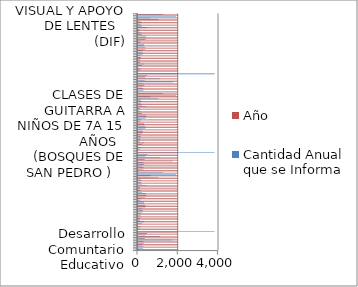
| Category | Cantidad Anual que se Informa | Año | Denominación del servicio |
|---|---|---|---|
| Desarrollo Comuntario Educativo | 100 | 2016 |  |
| Apoyo Escolar a niños de 5-12 años (San Antonio) | 300 | 2016 |  |
| Apoyo escolar a niños de 6 a 12 años en DIF | 300 | 2016 |  |
| Apoyo escolar niños de 6-12 años (Bosques de San Pedro) | 240 | 2016 |  |
| APOYO ESCOLAR  NIÑOS DE 5-12 AÑOS            (LOS REYES ) | 360 | 2016 |  |
| APOYO ESCOLAR    NIÑOS DE 5-12 AÑOS           (LOS  ENCINOS)  | 300 | 2016 |  |
| APOYO  EDUCATIVO CON ENFASIS EN LENGUAJE (DIF) | 1776 | 2016 |  |
| APOYO  PSICOLOGICO INFANTIL (DIF) | 366 | 2016 |  |
| APOYO  PSICOLOGICO  A ADOLESENTES (DIF) | 1128 | 2016 |  |
| APOYO  PSICOLOGICO  A ADULTOS (DIF) | 402 | 2016 |  |
| TERAPIAS DE GRUPO  (DIF)   | 492 | 2016 |  |
| REHABILITACION FISICA (DIF)  | 3840 | 2016 |  |
| APOYO DE EDUCACION EN  BRAYLE   (DIF) | 60 | 2016 |  |
| CLASES DE GUITARRA       (NIÑOS DE GUARDERIAS)    | 120 | 2016 |  |
| CLASES DE GUITARRA A NIÑOS DE 7  A 15 AÑOS  (DIF) | 180 | 2016 |  |
| CLASES DE GUITARRA A JOVENES MAYORES DE 15 AÑOS    (DIF) | 60 | 2016 |  |
| CLASES DE COMPUTACION  A  NIÑOS DE 7 A 12   AÑOS   (DIF) | 240 | 2016 |  |
| CLASES DE COMPUTACION  A  JOVENES MAYORES  DE 12   AÑOS (DIF)   | 360 | 2016 |  |
| CLASES DE GUITARRA A NIÑOS DE 7A 15 AÑOS (SAN ANTONIO)   | 144 | 2016 |  |
| CLASES DE GUITARRA A JOVENES MAYORES DE 15 AÑOS   (SAN ANTONIO)   | 144 | 2016 |  |
| CLASES DE COMPUTACION  A  NIÑOS DE 7 A 12   AÑOS               (SAN ANTONIO)   | 180 | 2016 |  |
| CLASES DE COMPUTACION  A  JOVENES MAYORES  DE 12   AÑOS                              (SAN ANTONIO)    | 180 | 2016 |  |
| CLASES DE GUITARRA A NIÑOS DE 7A 15 AÑOS   (BOSQUES DE SAN PEDRO )    | 180 | 2016 |  |
| CLASES DE GUITARRA A JOVENES MAYORES DE 15 AÑOS  (BOSQUES DE SAN PEDRO  )  | 270 | 2016 |  |
| CLASES DE COMPUTACION  A NIÑOS DE 7A 15 AÑOS   (BOSQUE SAN PEDRO  )    | 270 | 2016 |  |
| CLASES DE COMPUTACION  A JOVENES MAYORES DE 15 AÑOS  (BOSQUES PEDRO )  | 270 | 2016 |  |
| CLASES DE GUITARRA A NIÑOS DE 7A 15 AÑOS   (LOS REYES  )    | 420 | 2016 |  |
| CLASES DE GUITARRA A JOVENES MAYORES DE 15 AÑOS  (LOS REYES )  | 420 | 2016 |  |
| CLASES DE COMPUTACION  A NIÑOS DE 7A 15 AÑOS   (LOS REYES )    | 360 | 2016 |  |
| CLASES DE COMPUTACION  A JOVENES MAYORES DE 15 AÑOS  (LOS REYES )  | 360 | 2016 |  |
| CLASES DE GUITARRA A NIÑOS DE 7A 15 AÑOS   (LOS ENCINOS  )    | 144 | 2016 |  |
| CLASES DE GUITARRA A JOVENES MAYORES DE 15 AÑOS  (LOS ENCINOS  )  | 180 | 2016 |  |
| CLASES DE COMPUTACION A NIÑOS DE 7A 15 AÑOS   (LOS ENCINOS  )    | 420 | 2016 |  |
| CLASES DE COMPUTACION A JOVENES MAYORES DE 15 AÑOS  (LOS  ENCINOS  )  | 470 | 2016 |  |
| CLASES  MANUALIDADES Y BISUTERIA  AÑOS  (DIF) | 432 | 2016 |  |
| CLASES  MANUALIDADES Y BISUTERIA                     (SAN ANTONIO ) | 240 | 2016 |  |
| CLASES  MANUALIDADES Y BISUTERIA  AÑOS  (BOSQUES DE SABN PEDRO ) | 180 | 2016 |  |
| CLASES  MANUALIDADES Y BISUTERIA (LOS REYES ) | 120 | 2016 |  |
| CLASES DE  MANUALIDADES LOS (ENCINOS ) | 150 | 2016 |  |
| CLASES  MANUALIDADES Y BISUTERIA   (DIF) | 480 | 2016 |  |
| CLASES  MANUALIDADES Y BISUTERIA (SAN ANTONIO ) | 240 | 2016 |  |
| CLASES  MANUALIDADES Y BISUTERIA   (BOSQUES DE SAN PEDRO ) | 180 | 2016 |  |
| CLASES  MANUALIDADES Y BISUTERIA (LOS REYES ) | 240 | 2016 |  |
| CLASES DE  MANUALIDADES LOS (ENCINOS ) | 180 | 2016 |  |
| REVICION VISUAL Y APOYO DE LENTES   (DIF) | 1056 | 2016 |  |
| APOYO JURIDICO A NIÑAS NIÑOS Y ADOLECENTES    (DIF) | 660 | 2016 |  |
| APOYO JURIDICO Y ASESORIAS LEGALES   (DIF) | 1920 | 2016 |  |
| Consultas médicas | 1272 | 2016 |  |
| Desarrollo Comuntario Educativo | 100 | 2017 |  |
| Apoyo Escolar a niños de 5-12 años (San Antonio) | 300 | 2017 |  |
| Apoyo escolar a niños de 6 a 12 años en DIF | 300 | 2017 |  |
| Apoyo escolar niños de 6-12 años (Bosques de San Pedro) | 240 | 2017 |  |
| APOYO ESCOLAR  NIÑOS DE 5-12 AÑOS            (LOS REYES ) | 360 | 2017 |  |
| APOYO ESCOLAR    NIÑOS DE 5-12 AÑOS           (LOS  ENCINOS)  | 300 | 2017 |  |
| APOYO  EDUCATIVO CON ENFASIS EN LENGUAJE (DIF) | 1776 | 2017 |  |
| APOYO  PSICOLOGICO INFANTIL (DIF) | 366 | 2017 |  |
| APOYO  PSICOLOGICO  A ADOLESENTES (DIF) | 1128 | 2017 |  |
| APOYO  PSICOLOGICO  A ADULTOS (DIF) | 402 | 2017 |  |
| TERAPIAS DE GRUPO  (DIF)   | 492 | 2017 |  |
| REHABILITACION FISICA (DIF)  | 3840 | 2017 |  |
| APOYO DE EDUCACION EN  BRAYLE   (DIF) | 60 | 2017 |  |
| CLASES DE GUITARRA       (NIÑOS DE GUARDERIAS)    | 120 | 2017 |  |
| CLASES DE GUITARRA A NIÑOS DE 7  A 15 AÑOS  (DIF) | 180 | 2017 |  |
| CLASES DE GUITARRA A JOVENES MAYORES DE 15 AÑOS    (DIF) | 60 | 2017 |  |
| CLASES DE COMPUTACION  A  NIÑOS DE 7 A 12   AÑOS   (DIF) | 240 | 2017 |  |
| CLASES DE COMPUTACION  A  JOVENES MAYORES  DE 12   AÑOS (DIF)   | 360 | 2017 |  |
| CLASES DE GUITARRA A NIÑOS DE 7A 15 AÑOS (SAN ANTONIO)   | 144 | 2017 |  |
| CLASES DE GUITARRA A JOVENES MAYORES DE 15 AÑOS   (SAN ANTONIO)   | 144 | 2017 |  |
| CLASES DE COMPUTACION  A  NIÑOS DE 7 A 12   AÑOS               (SAN ANTONIO)   | 180 | 2017 |  |
| CLASES DE COMPUTACION  A  JOVENES MAYORES  DE 12   AÑOS                              (SAN ANTONIO)    | 180 | 2017 |  |
| CLASES DE GUITARRA A NIÑOS DE 7A 15 AÑOS   (BOSQUES DE SAN PEDRO )    | 180 | 2017 |  |
| CLASES DE GUITARRA A JOVENES MAYORES DE 15 AÑOS  (BOSQUES DE SAN PEDRO  )  | 270 | 2017 |  |
| CLASES DE COMPUTACION  A NIÑOS DE 7A 15 AÑOS   (BOSQUE SAN PEDRO  )    | 270 | 2017 |  |
| CLASES DE COMPUTACION  A JOVENES MAYORES DE 15 AÑOS  (BOSQUES PEDRO )  | 270 | 2017 |  |
| CLASES DE GUITARRA A NIÑOS DE 7A 15 AÑOS   (LOS REYES  )    | 420 | 2017 |  |
| CLASES DE GUITARRA A JOVENES MAYORES DE 15 AÑOS  (LOS REYES )  | 420 | 2017 |  |
| CLASES DE COMPUTACION  A NIÑOS DE 7A 15 AÑOS   (LOS REYES )    | 360 | 2017 |  |
| CLASES DE COMPUTACION  A JOVENES MAYORES DE 15 AÑOS  (LOS REYES )  | 360 | 2017 |  |
| CLASES DE GUITARRA A NIÑOS DE 7A 15 AÑOS   (LOS ENCINOS  )    | 144 | 2017 |  |
| CLASES DE GUITARRA A JOVENES MAYORES DE 15 AÑOS  (LOS ENCINOS  )  | 180 | 2017 |  |
| CLASES DE COMPUTACION A NIÑOS DE 7A 15 AÑOS   (LOS ENCINOS  )    | 420 | 2017 |  |
| CLASES DE COMPUTACION A JOVENES MAYORES DE 15 AÑOS  (LOS  ENCINOS  )  | 470 | 2017 |  |
| CLASES  MANUALIDADES Y BISUTERIA  AÑOS  (DIF) | 432 | 2017 |  |
| CLASES  MANUALIDADES Y BISUTERIA                     (SAN ANTONIO ) | 240 | 2017 |  |
| CLASES  MANUALIDADES Y BISUTERIA  AÑOS  (BOSQUES DE SABN PEDRO ) | 180 | 2017 |  |
| CLASES  MANUALIDADES Y BISUTERIA (LOS REYES ) | 120 | 2017 |  |
| CLASES DE  MANUALIDADES LOS (ENCINOS ) | 150 | 2017 |  |
| CLASES  MANUALIDADES Y BISUTERIA   (DIF) | 480 | 2017 |  |
| CLASES  MANUALIDADES Y BISUTERIA (SAN ANTONIO ) | 240 | 2017 |  |
| CLASES  MANUALIDADES Y BISUTERIA   (BOSQUES DE SAN PEDRO ) | 180 | 2017 |  |
| CLASES  MANUALIDADES Y BISUTERIA (LOS REYES ) | 240 | 2017 |  |
| CLASES DE  MANUALIDADES LOS (ENCINOS ) | 180 | 2017 |  |
| REVICION VISUAL Y APOYO DE LENTES   (DIF) | 1056 | 2017 |  |
| APOYO JURIDICO A NIÑAS NIÑOS Y ADOLECENTES    (DIF) | 660 | 2017 |  |
| APOYO JURIDICO Y ASESORIAS LEGALES   (DIF) | 1920 | 2017 |  |
| Consultas médicas | 1272 | 2017 |  |
| Desarrollo Comuntario Educativo | 100 | 2018 |  |
| Apoyo Escolar a niños de 5-12 años (San Antonio) | 300 | 2018 |  |
| Apoyo escolar a niños de 6 a 12 años en DIF | 300 | 2018 |  |
| Apoyo escolar niños de 6-12 años (Bosques de San Pedro) | 240 | 2018 |  |
| APOYO ESCOLAR  NIÑOS DE 5-12 AÑOS            (LOS REYES ) | 360 | 2018 |  |
| APOYO ESCOLAR    NIÑOS DE 5-12 AÑOS           (LOS  ENCINOS)  | 300 | 2018 |  |
| APOYO  EDUCATIVO CON ENFASIS EN LENGUAJE (DIF) | 1776 | 2018 |  |
| APOYO  PSICOLOGICO INFANTIL (DIF) | 366 | 2018 |  |
| APOYO  PSICOLOGICO  A ADOLESENTES (DIF) | 1128 | 2018 |  |
| APOYO  PSICOLOGICO  A ADULTOS (DIF) | 402 | 2018 |  |
| TERAPIAS DE GRUPO  (DIF)   | 492 | 2018 |  |
| REHABILITACION FISICA (DIF)  | 3840 | 2018 |  |
| APOYO DE EDUCACION EN  BRAYLE   (DIF) | 60 | 2018 |  |
| CLASES DE GUITARRA       (NIÑOS DE GUARDERIAS)    | 120 | 2018 |  |
| CLASES DE GUITARRA A NIÑOS DE 7  A 15 AÑOS  (DIF) | 180 | 2018 |  |
| CLASES DE GUITARRA A JOVENES MAYORES DE 15 AÑOS    (DIF) | 60 | 2018 |  |
| CLASES DE COMPUTACION  A  NIÑOS DE 7 A 12   AÑOS   (DIF) | 240 | 2018 |  |
| CLASES DE COMPUTACION  A  JOVENES MAYORES  DE 12   AÑOS (DIF)   | 360 | 2018 |  |
| CLASES DE GUITARRA A NIÑOS DE 7A 15 AÑOS (SAN ANTONIO)   | 144 | 2018 |  |
| CLASES DE GUITARRA A JOVENES MAYORES DE 15 AÑOS   (SAN ANTONIO)   | 144 | 2018 |  |
| CLASES DE COMPUTACION  A  NIÑOS DE 7 A 12   AÑOS               (SAN ANTONIO)   | 180 | 2018 |  |
| CLASES DE COMPUTACION  A  JOVENES MAYORES  DE 12   AÑOS                              (SAN ANTONIO)    | 180 | 2018 |  |
| CLASES DE GUITARRA A NIÑOS DE 7A 15 AÑOS   (BOSQUES DE SAN PEDRO )    | 180 | 2018 |  |
| CLASES DE GUITARRA A JOVENES MAYORES DE 15 AÑOS  (BOSQUES DE SAN PEDRO  )  | 270 | 2018 |  |
| CLASES DE COMPUTACION  A NIÑOS DE 7A 15 AÑOS   (BOSQUE SAN PEDRO  )    | 270 | 2018 |  |
| CLASES DE COMPUTACION  A JOVENES MAYORES DE 15 AÑOS  (BOSQUES PEDRO )  | 270 | 2018 |  |
| CLASES DE GUITARRA A NIÑOS DE 7A 15 AÑOS   (LOS REYES  )    | 420 | 2018 |  |
| CLASES DE GUITARRA A JOVENES MAYORES DE 15 AÑOS  (LOS REYES )  | 420 | 2018 |  |
| CLASES DE COMPUTACION  A NIÑOS DE 7A 15 AÑOS   (LOS REYES )    | 360 | 2018 |  |
| CLASES DE COMPUTACION  A JOVENES MAYORES DE 15 AÑOS  (LOS REYES )  | 360 | 2018 |  |
| CLASES DE GUITARRA A NIÑOS DE 7A 15 AÑOS   (LOS ENCINOS  )    | 144 | 2018 |  |
| CLASES DE GUITARRA A JOVENES MAYORES DE 15 AÑOS  (LOS ENCINOS  )  | 180 | 2018 |  |
| CLASES DE COMPUTACION A NIÑOS DE 7A 15 AÑOS   (LOS ENCINOS  )    | 420 | 2018 |  |
| CLASES DE COMPUTACION A JOVENES MAYORES DE 15 AÑOS  (LOS  ENCINOS  )  | 470 | 2018 |  |
| CLASES  MANUALIDADES Y BISUTERIA  AÑOS  (DIF) | 432 | 2018 |  |
| CLASES  MANUALIDADES Y BISUTERIA                     (SAN ANTONIO ) | 240 | 2018 |  |
| CLASES  MANUALIDADES Y BISUTERIA  AÑOS  (BOSQUES DE SABN PEDRO ) | 180 | 2018 |  |
| CLASES  MANUALIDADES Y BISUTERIA (LOS REYES ) | 120 | 2018 |  |
| CLASES DE  MANUALIDADES LOS (ENCINOS ) | 150 | 2018 |  |
| CLASES  MANUALIDADES Y BISUTERIA   (DIF) | 480 | 2018 |  |
| CLASES  MANUALIDADES Y BISUTERIA (SAN ANTONIO ) | 240 | 2018 |  |
| CLASES  MANUALIDADES Y BISUTERIA   (BOSQUES DE SAN PEDRO ) | 180 | 2018 |  |
| CLASES  MANUALIDADES Y BISUTERIA (LOS REYES ) | 240 | 2018 |  |
| CLASES DE  MANUALIDADES LOS (ENCINOS ) | 180 | 2018 |  |
| REVICION VISUAL Y APOYO DE LENTES   (DIF) | 1056 | 2018 |  |
| APOYO JURIDICO A NIÑAS NIÑOS Y ADOLECENTES    (DIF) | 660 | 2018 |  |
| APOYO JURIDICO Y ASESORIAS LEGALES   (DIF) | 1920 | 2018 |  |
| Consultas médicas | 1272 | 2018 |  |